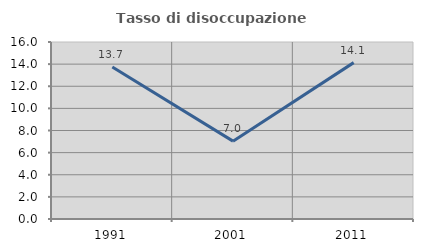
| Category | Tasso di disoccupazione giovanile  |
|---|---|
| 1991.0 | 13.735 |
| 2001.0 | 7.037 |
| 2011.0 | 14.136 |